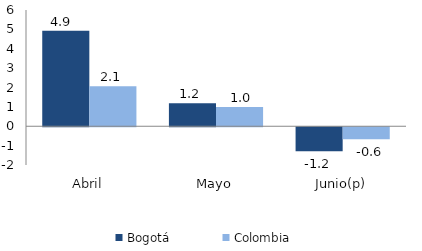
| Category | Bogotá | Colombia |
|---|---|---|
| Abril | 4.934 | 2.07 |
| Mayo | 1.188 | 0.991 |
| Junio(p) | -1.241 | -0.618 |